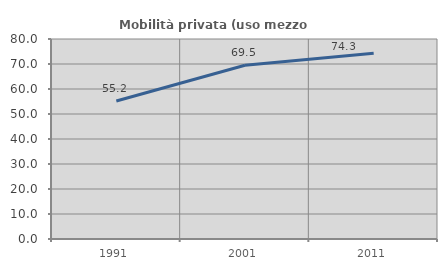
| Category | Mobilità privata (uso mezzo privato) |
|---|---|
| 1991.0 | 55.212 |
| 2001.0 | 69.474 |
| 2011.0 | 74.305 |